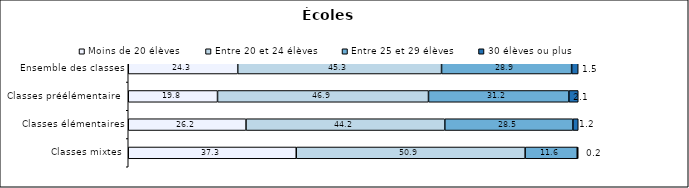
| Category | Moins de 20 élèves | Entre 20 et 24 élèves | Entre 25 et 29 élèves | 30 élèves ou plus |
|---|---|---|---|---|
| Classes mixtes | 37.33 | 50.87 | 11.58 | 0.22 |
| Classes élémentaires | 26.17 | 44.18 | 28.46 | 1.19 |
| Classes préélémentaires | 19.84 | 46.88 | 31.2 | 2.08 |
| Ensemble des classes | 24.33 | 45.29 | 28.91 | 1.46 |